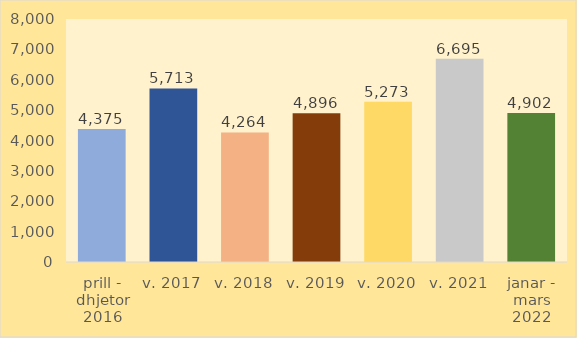
| Category | Sipërfaqe mesatare për ndërtim të ri, m2 |
|---|---|
| prill - dhjetor 2016 | 4374.67 |
| v. 2017 | 5713.019 |
| v. 2018 | 4264.283 |
| v. 2019 | 4895.888 |
| v. 2020 | 5272.788 |
| v. 2021 | 6694.587 |
| janar - mars 2022 | 4902.477 |